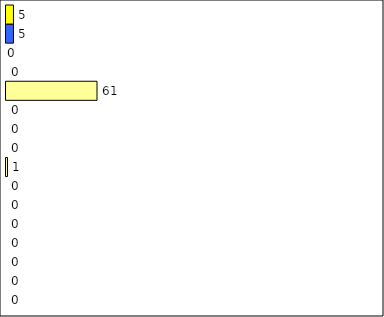
| Category | -2 | -1 | 0 | 1 | 2 | 3 | 4 | 5 | 6 | 7 | 8 | 9 | 10 | 11 | 12 | Perfect Round |
|---|---|---|---|---|---|---|---|---|---|---|---|---|---|---|---|---|
| 0 | 0 | 0 | 0 | 0 | 0 | 0 | 0 | 1 | 0 | 0 | 0 | 61 | 0 | 0 | 5 | 5 |